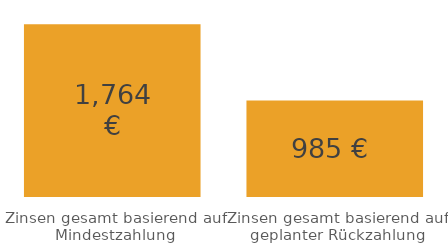
| Category | Series 0 |
|---|---|
| Zinsen gesamt basierend auf Mindestzahlung | 1763.952 |
| Zinsen gesamt basierend auf geplanter Rückzahlung | 984.811 |